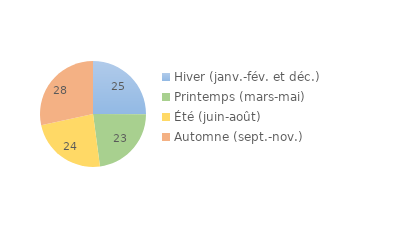
| Category | Series 0 |
|---|---|
| Hiver (janv.-fév. et déc.) | 25.059 |
| Printemps (mars-mai) | 22.836 |
| Été (juin-août) | 23.724 |
| Automne (sept.-nov.) | 28.381 |